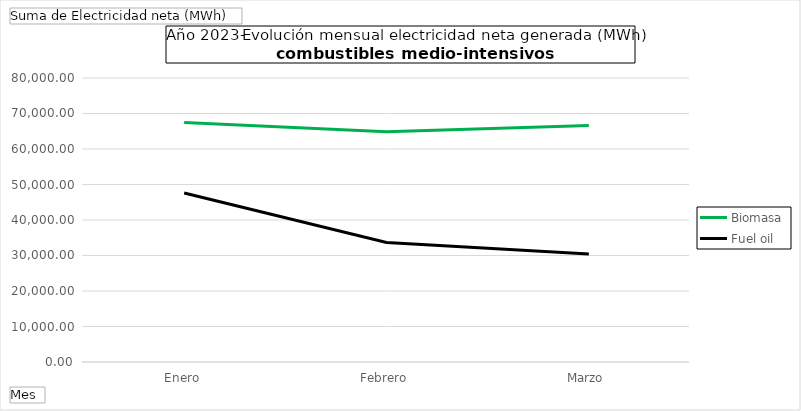
| Category | Biomasa | Fuel oil |
|---|---|---|
| Enero | 67468.3 | 47619.02 |
| Febrero | 64886.92 | 33661.83 |
| Marzo | 66606.9 | 30445.68 |